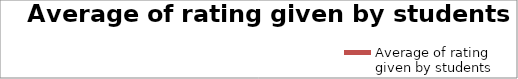
| Category | Average of rating given by students |
|---|---|
| teacher comes to class | 5 |
| Control of class | 4.8 |
| Command over English | 4.8 |
| Offers assistance/          motivation to learn | 5 |
| Encourages to ask questions | 4.5 |
| Knowledge of the subject | 5 |
| Method of Teaching and expression | 4.9 |
| Answers questions raised by you as per expectations | 4.7 |
| Completion of syllabus | 5 |
| Depth of the subject | 5 |
| Experimental skills in Labs  | 5 |
| Interaction with students in Tutorial class | 4.5 |
| Regularity in evaluation  of  assignments, class tests etc. | 5 |
| Innovative ideas and methods to teach | 4.9 |
| Assessment of students | 4.6 |